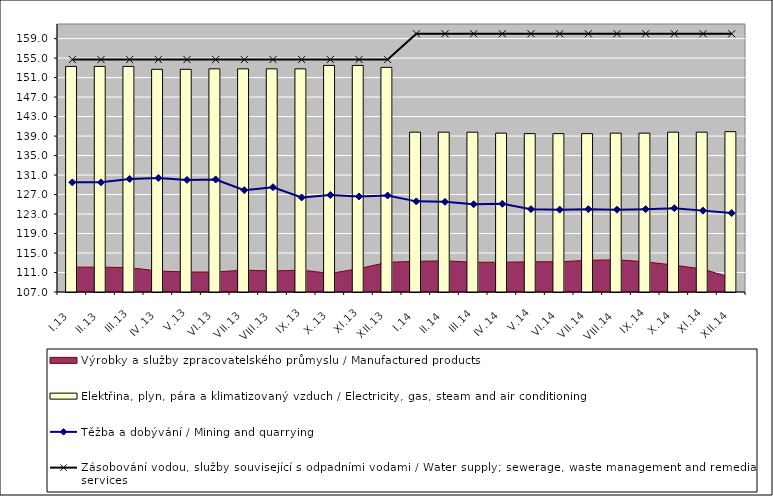
| Category | Elektřina, plyn, pára a klimatizovaný vzduch / Electricity, gas, steam and air conditioning |
|---|---|
| I.13 | 153.3 |
| II.13 | 153.3 |
| III.13 | 153.3 |
| IV.13 | 152.7 |
| V.13 | 152.7 |
| VI.13 | 152.8 |
| VII.13 | 152.8 |
| VIII.13 | 152.8 |
| IX.13 | 152.8 |
| X.13 | 153.5 |
| XI.13 | 153.5 |
| XII.13 | 153.1 |
| I.14 | 139.8 |
| II.14 | 139.8 |
| III.14 | 139.8 |
| IV.14 | 139.6 |
| V.14 | 139.5 |
| VI.14 | 139.5 |
| VII.14 | 139.5 |
| VIII.14 | 139.6 |
| IX.14 | 139.6 |
| X.14 | 139.8 |
| XI.14 | 139.8 |
| XII.14 | 139.9 |